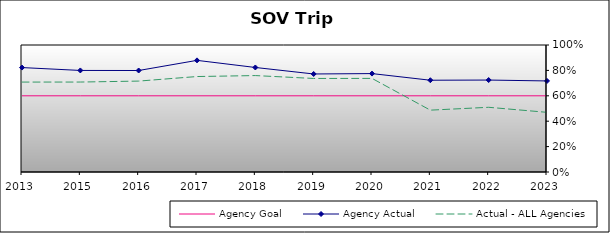
| Category | Agency Goal | Agency Actual | Actual - ALL Agencies |
|---|---|---|---|
| 2013.0 | 0.6 | 0.822 | 0.708 |
| 2015.0 | 0.6 | 0.8 | 0.708 |
| 2016.0 | 0.6 | 0.799 | 0.716 |
| 2017.0 | 0.6 | 0.879 | 0.752 |
| 2018.0 | 0.6 | 0.823 | 0.759 |
| 2019.0 | 0.6 | 0.772 | 0.736 |
| 2020.0 | 0.6 | 0.775 | 0.737 |
| 2021.0 | 0.6 | 0.723 | 0.487 |
| 2022.0 | 0.6 | 0.724 | 0.509 |
| 2023.0 | 0.6 | 0.717 | 0.47 |